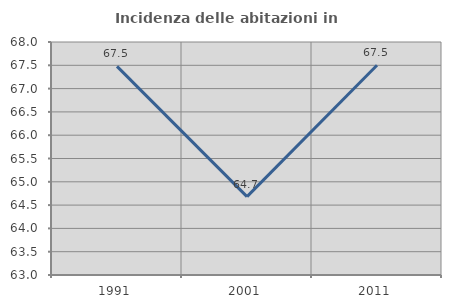
| Category | Incidenza delle abitazioni in proprietà  |
|---|---|
| 1991.0 | 67.476 |
| 2001.0 | 64.683 |
| 2011.0 | 67.5 |